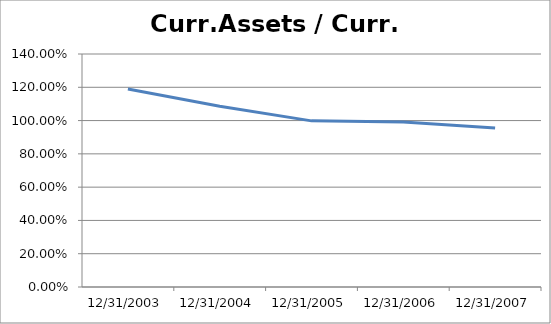
| Category | Liquidity |
|---|---|
| 31/12/2003 | 1.189 |
| 31/12/2004 | 1.087 |
| 31/12/2005 | 0.998 |
| 31/12/2006 | 0.991 |
| 31/12/2007 | 0.955 |